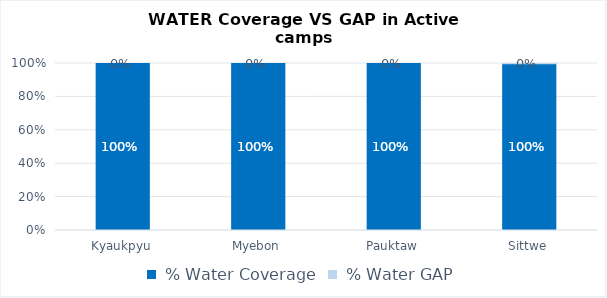
| Category |  % Water Coverage |  % Water GAP |
|---|---|---|
| Kyaukpyu | 1 | 0 |
| Myebon | 1 | 0 |
| Pauktaw | 1 | 0 |
| Sittwe | 0.999 | 0.001 |